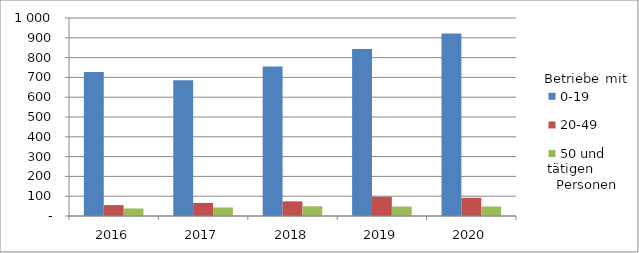
| Category | 0-19 | 20-49 | 50 und mehr |
|---|---|---|---|
| 2016.0 | 727 | 55 | 38 |
| 2017.0 | 685 | 66 | 43 |
| 2018.0 | 755 | 74 | 49 |
| 2019.0 | 844 | 97 | 48 |
| 2020.0 | 922 | 92 | 48 |